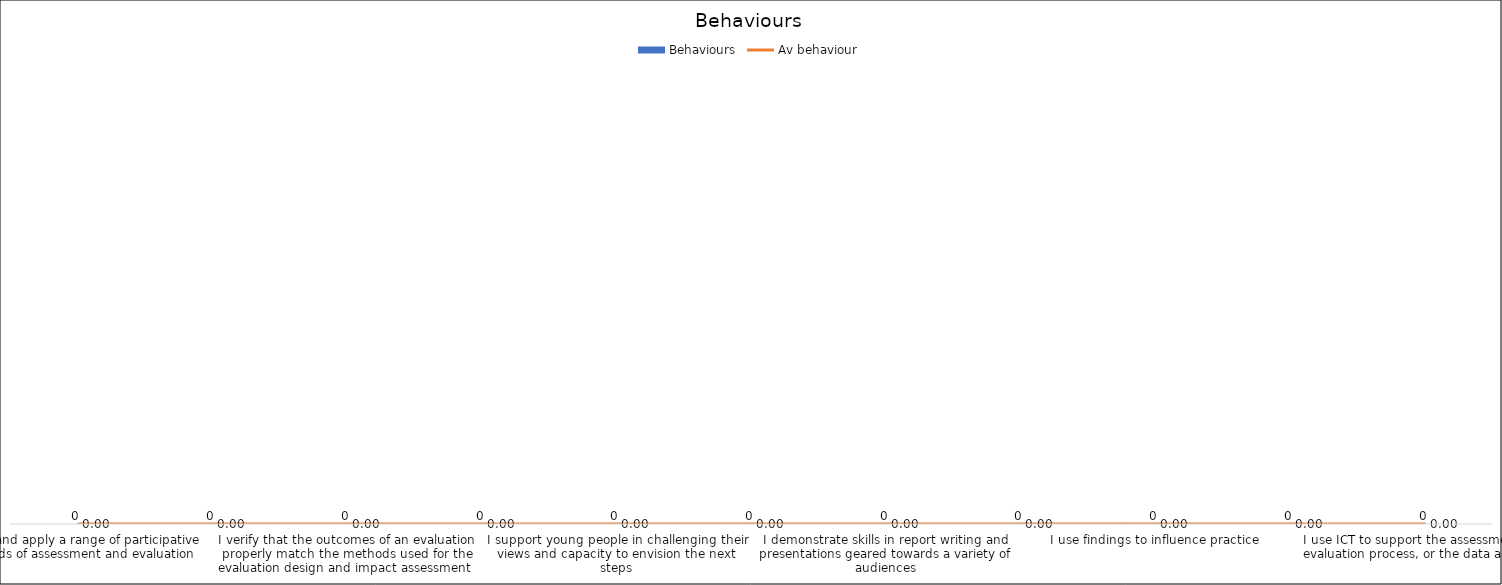
| Category | Behaviours |
|---|---|
| I plan and apply a range of participative methods of assessment and evaluation | 0 |
| I develop adequate assessment approaches  | 0 |
| I verify that the outcomes of an evaluation properly match the methods used for the evaluation design and impact assessment  | 0 |
| I deal explicitly with the notion of change and transformation | 0 |
| I support young people in challenging their views and capacity to envision the next steps | 0 |
| I encourage creativity when dealing with the follow-up of a given experience | 0 |
| I demonstrate skills in report writing and presentations geared towards a variety of audiences | 0 |
| I define appropriate ways to collect relevant information/data  | 0 |
| I use findings to influence practice | 0 |
| I interpret information/data according to the profile and contexts of young people | 0 |
| I use ICT to support the assessment and evaluation process, or the data analysis  | 0 |